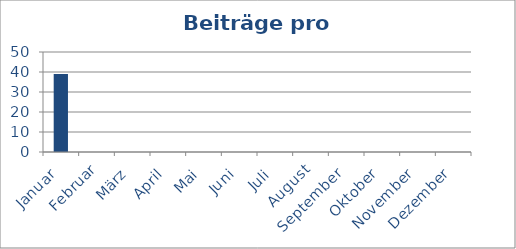
| Category | Beiträge |
|---|---|
| Januar | 39 |
| Februar | 0 |
| März | 0 |
| April | 0 |
| Mai | 0 |
| Juni | 0 |
| Juli | 0 |
| August | 0 |
| September | 0 |
| Oktober | 0 |
| November | 0 |
| Dezember | 0 |